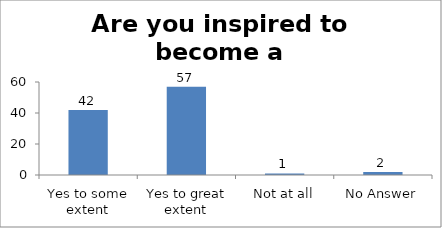
| Category | Are you inspired to become a Changemaker?   |
|---|---|
| Yes to some extent | 42 |
| Yes to great extent | 57 |
| Not at all | 1 |
| No Answer | 2 |